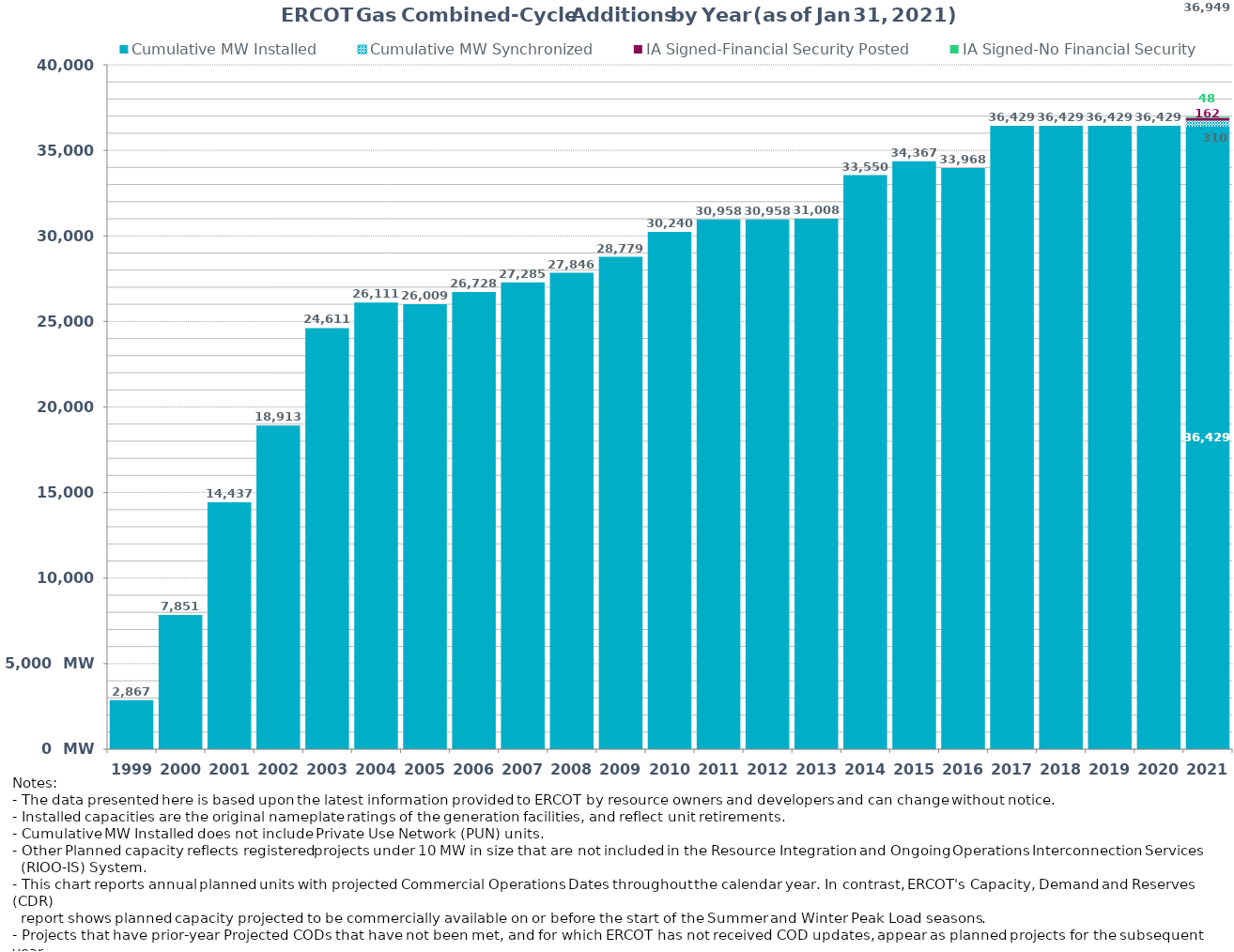
| Category | Cumulative MW Installed | Cumulative MW Synchronized | IA Signed-Financial Security Posted  | IA Signed-No Financial Security  | Other Planned | Cumulative Installed and Planned |
|---|---|---|---|---|---|---|
| 1999.0 | 2867 | 0 | 0 | 0 | 0 | 2867 |
| 2000.0 | 7851 | 0 | 0 | 0 | 0 | 7851 |
| 2001.0 | 14437 | 0 | 0 | 0 | 0 | 14437 |
| 2002.0 | 18913 | 0 | 0 | 0 | 0 | 18913 |
| 2003.0 | 24611 | 0 | 0 | 0 | 0 | 24611 |
| 2004.0 | 26111 | 0 | 0 | 0 | 0 | 26111 |
| 2005.0 | 26009 | 0 | 0 | 0 | 0 | 26009 |
| 2006.0 | 26728 | 0 | 0 | 0 | 0 | 26728 |
| 2007.0 | 27285 | 0 | 0 | 0 | 0 | 27285 |
| 2008.0 | 27846 | 0 | 0 | 0 | 0 | 27846 |
| 2009.0 | 28779 | 0 | 0 | 0 | 0 | 28779 |
| 2010.0 | 30240 | 0 | 0 | 0 | 0 | 30240 |
| 2011.0 | 30958 | 0 | 0 | 0 | 0 | 30958 |
| 2012.0 | 30958 | 0 | 0 | 0 | 0 | 30958 |
| 2013.0 | 31008 | 0 | 0 | 0 | 0 | 31008 |
| 2014.0 | 33550 | 0 | 0 | 0 | 0 | 33550 |
| 2015.0 | 34367 | 0 | 0 | 0 | 0 | 34367 |
| 2016.0 | 33968 | 0 | 0 | 0 | 0 | 33968 |
| 2017.0 | 36429 | 0 | 0 | 0 | 0 | 36429 |
| 2018.0 | 36429 | 0 | 0 | 0 | 0 | 36429 |
| 2019.0 | 36429 | 0 | 0 | 0 | 0 | 36429 |
| 2020.0 | 36429 | 0 | 0 | 0 | 0 | 36429 |
| 2021.0 | 36429 | 310 | 162 | 48 | 0 | 36949 |